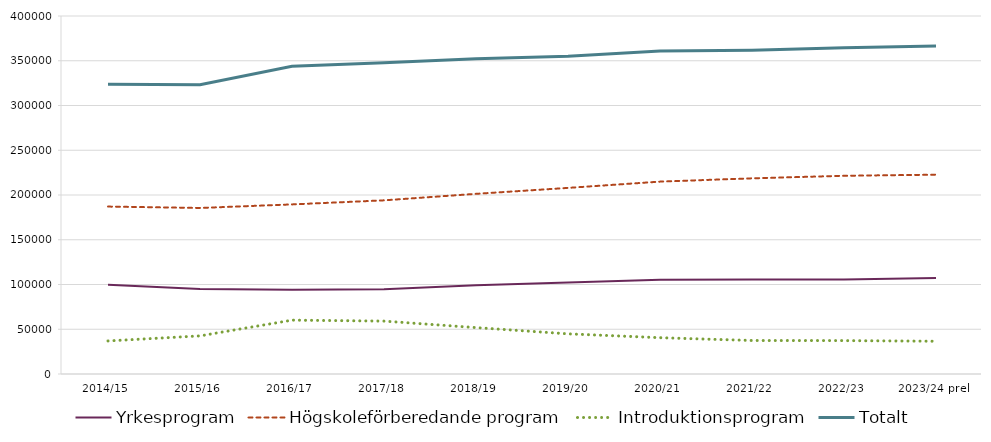
| Category | Yrkesprogram | Högskoleförberedande program | Introduktionsprogram | Totalt |
|---|---|---|---|---|
| 2014/15 | 99681 | 187056 | 36933 | 323670 |
| 2015/16 | 95042 | 185509 | 42590 | 323141 |
| 2016/17 | 94232 | 189491 | 60188 | 343911 |
| 2017/18 | 94730 | 194036 | 59097 | 347863 |
| 2018/19 | 99152 | 201304 | 51830 | 352286 |
| 2019/20 | 102191 | 207936 | 44877 | 355004 |
| 2020/21 | 105352 | 214944 | 40551 | 360847 |
| 2021/22 | 105618 | 218623 | 37432 | 361673 |
| 2022/23 | 105637 | 221490 | 37304 | 364431 |
| 2023/24 prel | 107300 | 222700 | 36600 | 366600 |